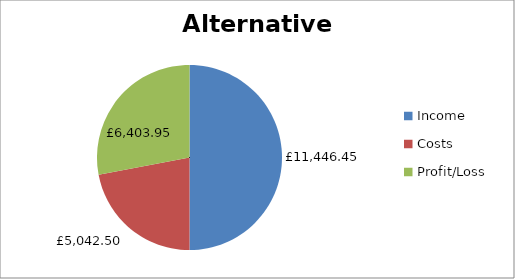
| Category | Income Costs Profit/Loss |
|---|---|
| Income | 11446.45 |
| Costs | 5042.5 |
| Profit/Loss | 6403.95 |